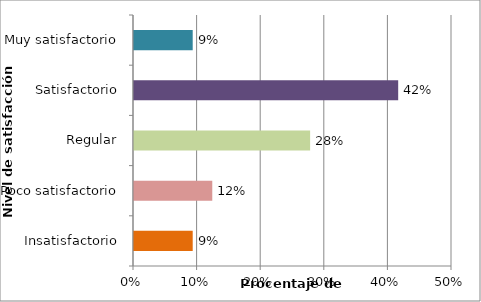
| Category | Porcentaje |
|---|---|
| Insatisfactorio | 0.092 |
| Poco satisfactorio | 0.123 |
| Regular | 0.277 |
| Satisfactorio | 0.415 |
| Muy satisfactorio | 0.092 |